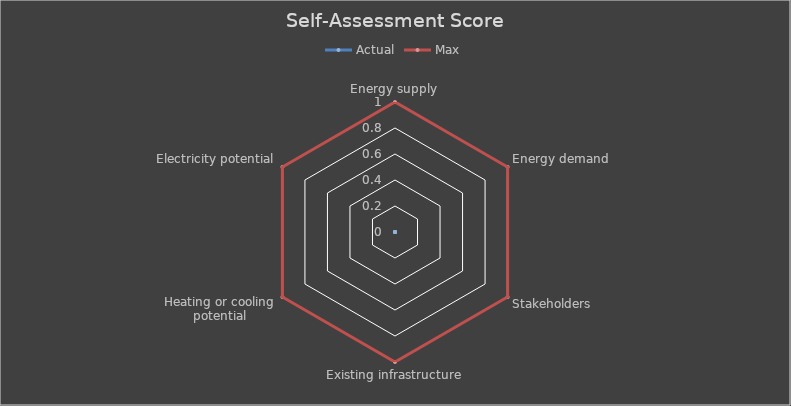
| Category | Actual | Max |
|---|---|---|
| Energy supply | 0 | 1 |
| Energy demand | 0 | 1 |
| Stakeholders | 0 | 1 |
| Existing infrastructure | 0 | 1 |
| Heating or cooling potential | 0 | 1 |
| Electricity potential | 0 | 1 |